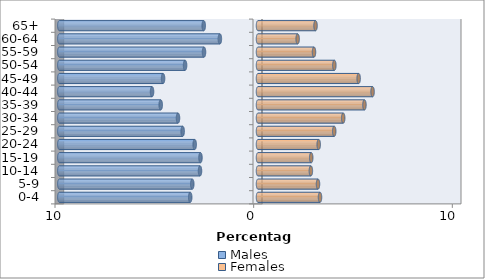
| Category | Males | Females |
|---|---|---|
| 0-4 | -3.412 | 3.121 |
| 5-9 | -3.308 | 3.02 |
| 10-14 | -2.919 | 2.661 |
| 15-19 | -2.896 | 2.679 |
| 20-24 | -3.187 | 3.056 |
| 25-29 | -3.793 | 3.837 |
| 30-34 | -4.027 | 4.289 |
| 35-39 | -4.897 | 5.358 |
| 40-44 | -5.334 | 5.768 |
| 45-49 | -4.779 | 5.067 |
| 50-54 | -3.671 | 3.843 |
| 55-59 | -2.717 | 2.818 |
| 60-64 | -1.919 | 1.996 |
| 65+ | -2.732 | 2.896 |